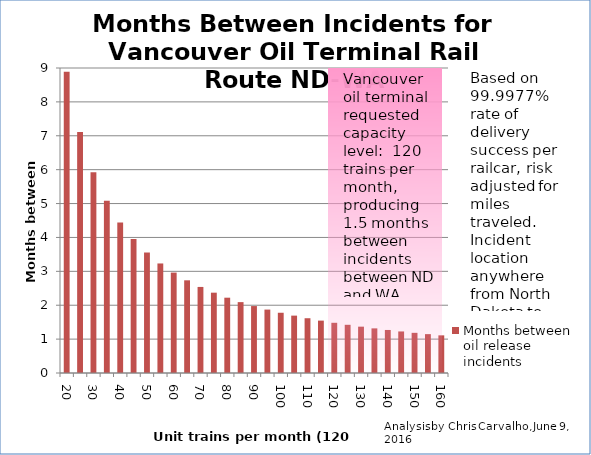
| Category | Months between oil release incidents |
|---|---|
| 20.0 | 8.889 |
| 25.0 | 7.111 |
| 30.0 | 5.926 |
| 35.0 | 5.079 |
| 40.0 | 4.444 |
| 45.0 | 3.951 |
| 50.0 | 3.556 |
| 55.0 | 3.232 |
| 60.0 | 2.963 |
| 65.0 | 2.735 |
| 70.0 | 2.54 |
| 75.0 | 2.37 |
| 80.0 | 2.222 |
| 85.0 | 2.091 |
| 90.0 | 1.975 |
| 95.0 | 1.871 |
| 100.0 | 1.778 |
| 105.0 | 1.693 |
| 110.0 | 1.616 |
| 115.0 | 1.546 |
| 120.0 | 1.481 |
| 125.0 | 1.422 |
| 130.0 | 1.368 |
| 135.0 | 1.317 |
| 140.0 | 1.27 |
| 145.0 | 1.226 |
| 150.0 | 1.185 |
| 155.0 | 1.147 |
| 160.0 | 1.111 |